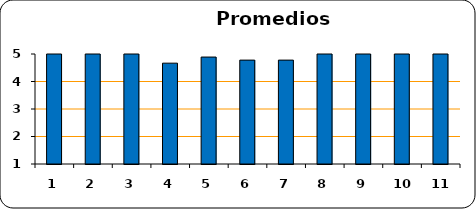
| Category | Series 0 |
|---|---|
| 0 | 5 |
| 1 | 5 |
| 2 | 5 |
| 3 | 4.667 |
| 4 | 4.889 |
| 5 | 4.778 |
| 6 | 4.778 |
| 7 | 5 |
| 8 | 5 |
| 9 | 5 |
| 10 | 5 |